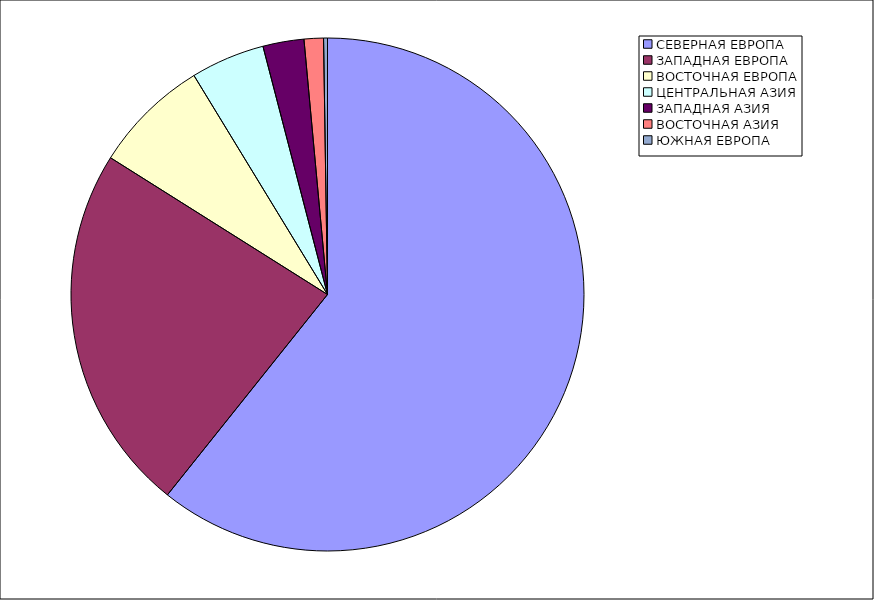
| Category | Оборот |
|---|---|
| СЕВЕРНАЯ ЕВРОПА | 60.727 |
| ЗАПАДНАЯ ЕВРОПА | 23.221 |
| ВОСТОЧНАЯ ЕВРОПА | 7.336 |
| ЦЕНТРАЛЬНАЯ АЗИЯ | 4.666 |
| ЗАПАДНАЯ АЗИЯ | 2.585 |
| ВОСТОЧНАЯ АЗИЯ | 1.219 |
| ЮЖНАЯ ЕВРОПА | 0.246 |